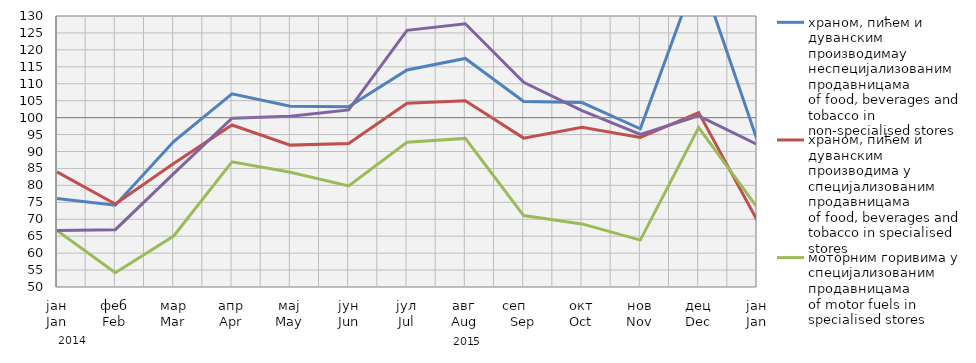
| Category | храном, пићем и дуванским производимау неспецијализованим продавницама
of food, beverages and tobacco in non-specialised stores
 | храном, пићем и дуванским производима у специјализовaним продавницама
of food, beverages and tobacco in specialised stores | моторним горивима у специјализованим продавницама
of motor fuels in specialised stores | остала
other |
|---|---|---|---|---|
| јан
Jan | 76.105 | 83.983 | 66.659 | 66.673 |
| феб
Feb | 74.124 | 74.495 | 54.212 | 66.916 |
| мар
Mar | 92.948 | 86.45 | 65.042 | 83.485 |
| апр
Apr | 107.029 | 97.818 | 86.958 | 99.837 |
| мај
May | 103.34 | 91.883 | 83.858 | 100.375 |
| јун
Jun | 103.24 | 92.338 | 79.832 | 102.276 |
| јул
Jul | 114.087 | 104.214 | 92.74 | 125.76 |
| авг
Aug | 117.466 | 104.989 | 93.864 | 127.707 |
| сеп     Sep | 104.752 | 93.955 | 71.088 | 110.411 |
| окт
Oct | 104.453 | 97.122 | 68.621 | 102.068 |
| нов
Nov | 96.708 | 94.151 | 63.847 | 95.032 |
| дец
Dec | 143.807 | 101.476 | 97.056 | 100.534 |
| јан
Jan | 93.503 | 69.78 | 73.557 | 92.111 |